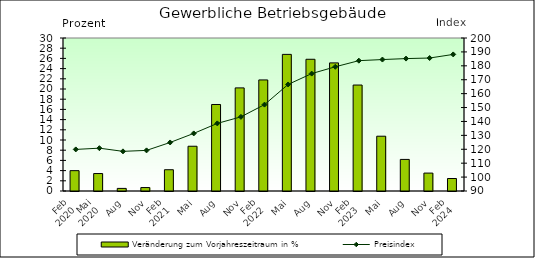
| Category | Veränderung zum Vorjahreszeitraum in % |
|---|---|
| 0 | 3.99 |
| 1 | 3.425 |
| 2 | 0.509 |
| 3 | 0.676 |
| 4 | 4.17 |
| 5 | 8.775 |
| 6 | 16.962 |
| 7 | 20.218 |
| 8 | 21.777 |
| 9 | 26.788 |
| 10 | 25.83 |
| 11 | 25.122 |
| 12 | 20.776 |
| 13 | 10.744 |
| 14 | 6.193 |
| 15 | 3.514 |
| 16 | 2.45 |